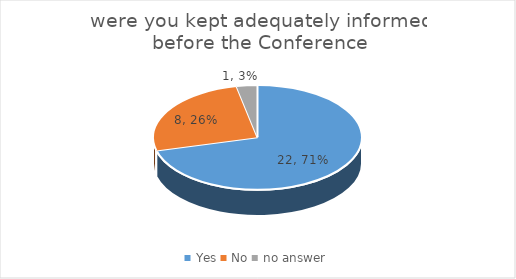
| Category | Series 0 |
|---|---|
| Yes | 22 |
| No | 8 |
| no answer | 1 |